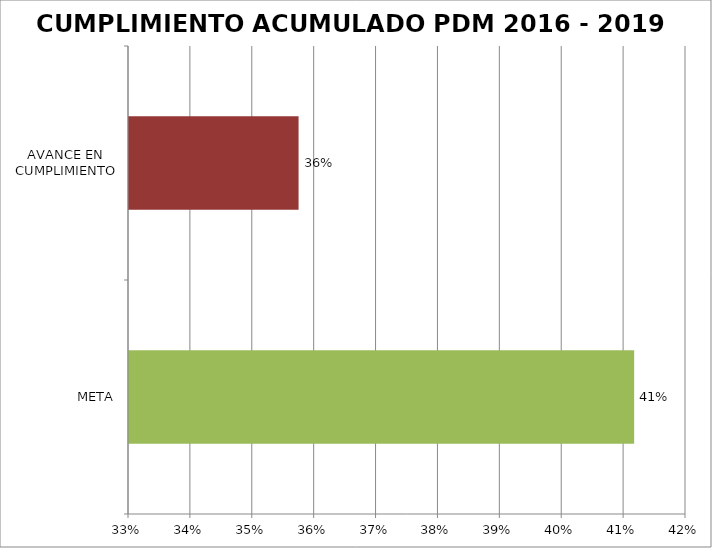
| Category | Series 0 |
|---|---|
| META | 0.412 |
| AVANCE EN CUMPLIMIENTO | 0.357 |